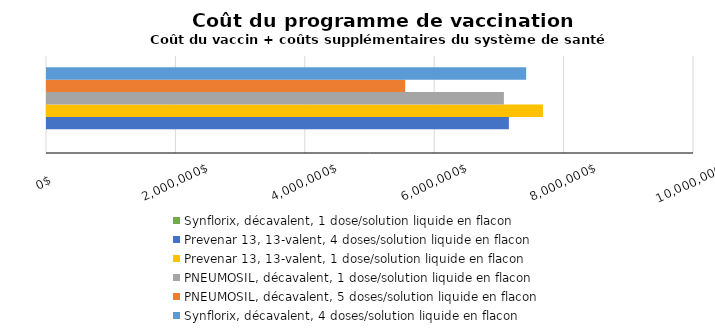
| Category | Synflorix, décavalent, 1 dose/solution liquide en flacon | Prevenar 13, 13-valent, 4 doses/solution liquide en flacon | Prevenar 13, 13-valent, 1 dose/solution liquide en flacon | PNEUMOSIL, décavalent, 1 dose/solution liquide en flacon | PNEUMOSIL, décavalent, 5 doses/solution liquide en flacon | Synflorix, décavalent, 4 doses/solution liquide en flacon |
|---|---|---|---|---|---|---|
| Total
pour 10 ans | 0 | 7138763.915 | 7665433.37 | 7061918.905 | 5536264.325 | 7405847.18 |